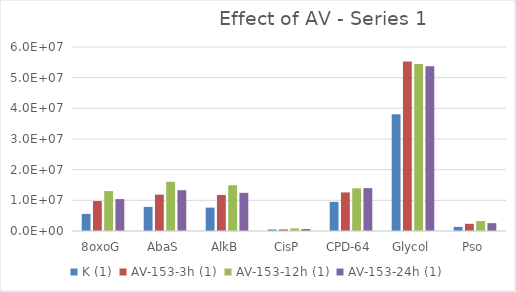
| Category | K (1) | AV-153-3h (1) | AV-153-12h (1) | AV-153-24h (1) |
|---|---|---|---|---|
| 8oxoG | 5574185 | 9770241.5 | 13021423 | 10406547.5 |
| AbaS | 7846556 | 11840324 | 16058357.5 | 13298264 |
| AlkB | 7619358.5 | 11759510.5 | 14921560 | 12439596 |
| CisP | 508904 | 515523 | 842058 | 635827 |
| CPD-64 | 9498738 | 12569129 | 13927796 | 13983943.5 |
| Glycol | 38102489.5 | 55302041.5 | 54466255.5 | 53705356 |
| Pso | 1348511 | 2352274.5 | 3244829.5 | 2564263.5 |